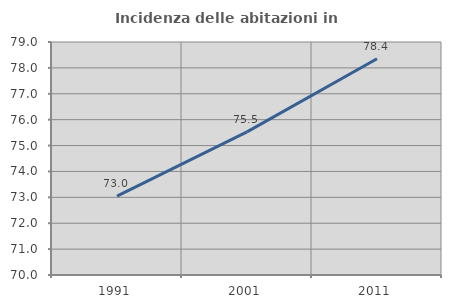
| Category | Incidenza delle abitazioni in proprietà  |
|---|---|
| 1991.0 | 73.047 |
| 2001.0 | 75.528 |
| 2011.0 | 78.355 |